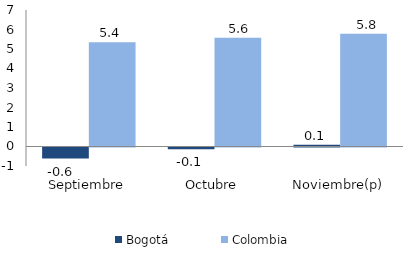
| Category | Bogotá | Colombia |
|---|---|---|
| Septiembre | -0.57 | 5.352 |
| Octubre | -0.089 | 5.58 |
| Noviembre(p) | 0.096 | 5.783 |